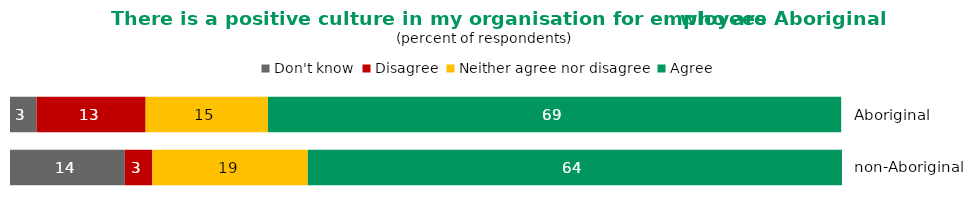
| Category | Don't know | Disagree | Neither agree nor disagree | Agree |
|---|---|---|---|---|
| Aboriginal | 3.2 | 13.1 | 14.7 | 68.9 |
| non-Aboriginal | 13.8 | 3.3 | 18.7 | 64.2 |